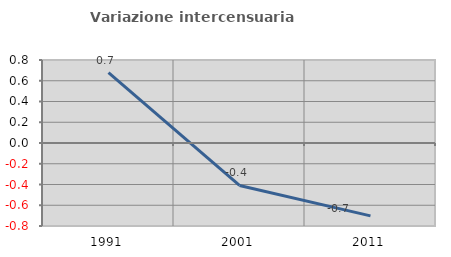
| Category | Variazione intercensuaria annua |
|---|---|
| 1991.0 | 0.678 |
| 2001.0 | -0.409 |
| 2011.0 | -0.702 |